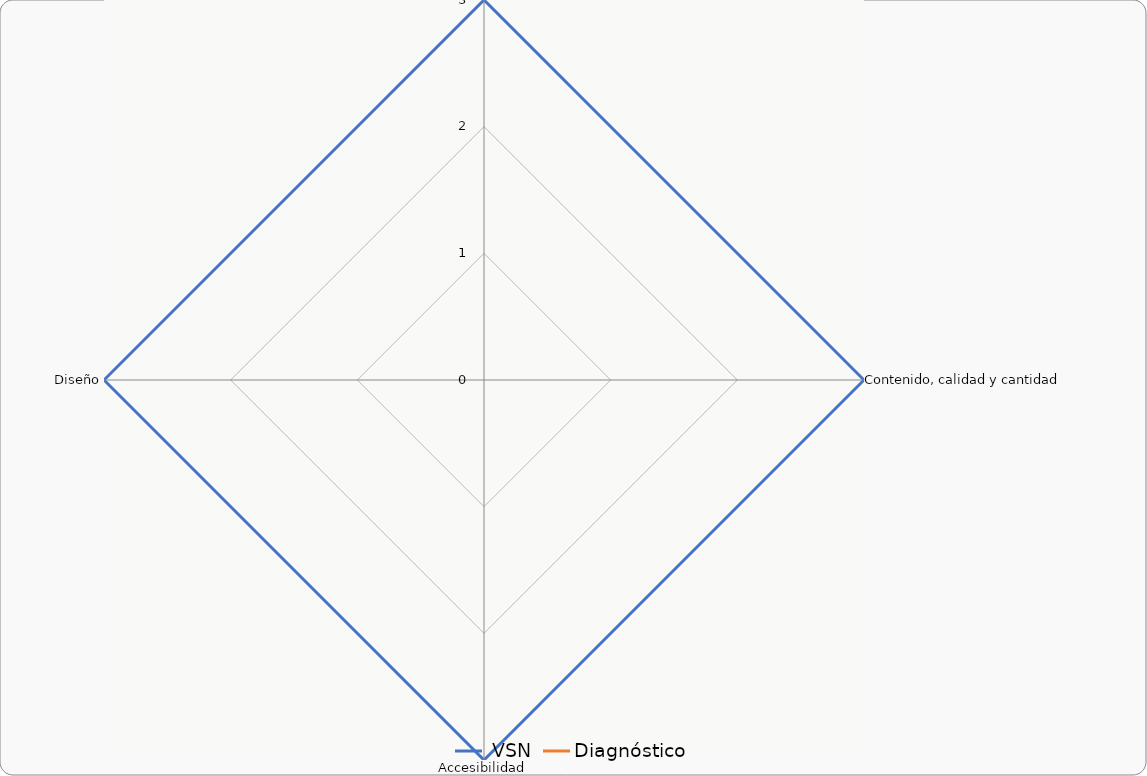
| Category |  VSN | Diagnóstico |
|---|---|---|
| Credibilidad | 3 | 0 |
| Contenido, calidad y cantidad | 3 | 0 |
| Accesibilidad | 3 | 0 |
| Diseño | 3 | 0 |